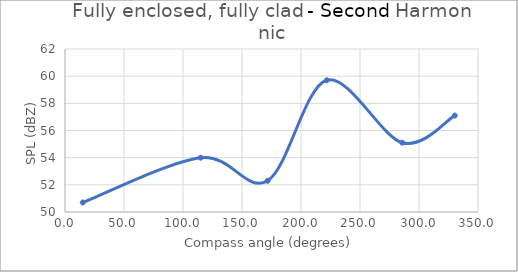
| Category | Series 0 |
|---|---|
| 15.06445125542554 | 50.7 |
| 115.00449447818254 | 54 |
| 171.7068171198818 | 52.3 |
| 221.8691292075067 | 59.7 |
| 285.7828166838848 | 55.1 |
| 330.28010595813004 | 57.1 |